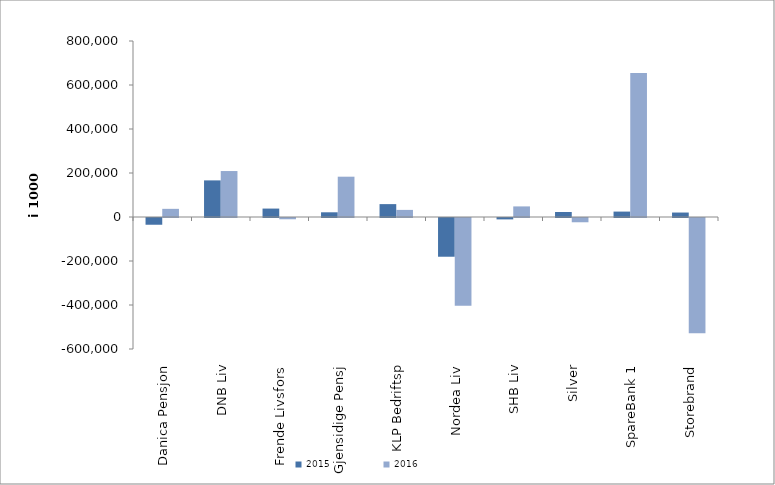
| Category | 2015 | 2016 |
|---|---|---|
| 0 | -30643.935 | 37077.396 |
| 1 | 166420 | 208921 |
| 2 | 38291 | -5750.464 |
| 3 | 21403.637 | 183221.284 |
| 4 | 58569 | 32282 |
| 5 | -176070.556 | -398530.236 |
| 6 | -6326 | 48162 |
| 7 | 22825.487 | -19388 |
| 8 | 24611.235 | 654348.207 |
| 9 | 20268.996 | -523421.858 |